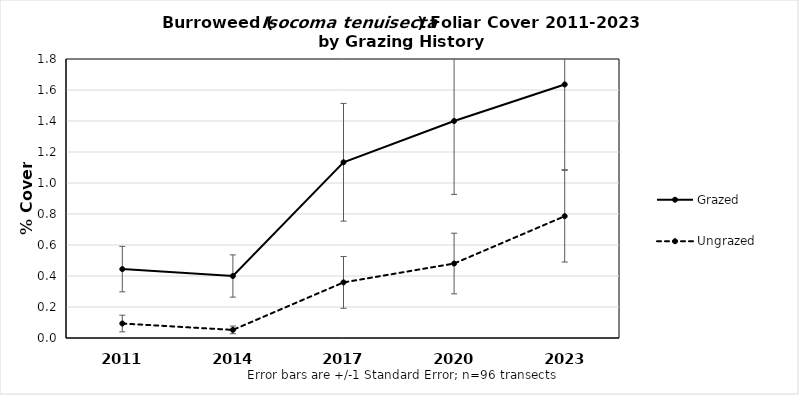
| Category | Grazed | Ungrazed |
|---|---|---|
| 2011.0 | 0.445 | 0.093 |
| 2014.0 | 0.4 | 0.052 |
| 2017.0 | 1.134 | 0.359 |
| 2020.0 | 1.4 | 0.48 |
| 2023.0 | 1.636 | 0.786 |